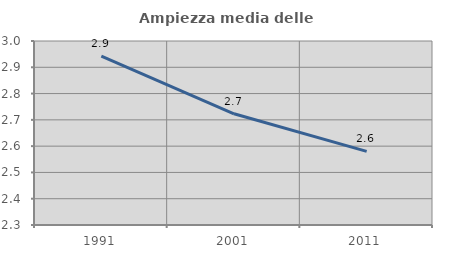
| Category | Ampiezza media delle famiglie |
|---|---|
| 1991.0 | 2.943 |
| 2001.0 | 2.723 |
| 2011.0 | 2.58 |